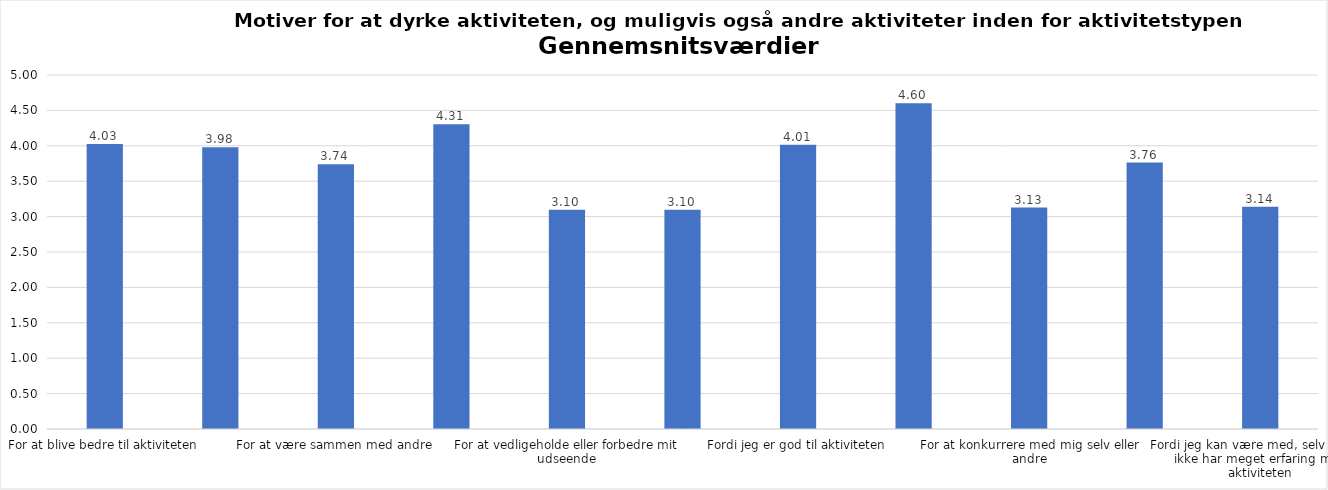
| Category | Gennemsnit |
|---|---|
| For at blive bedre til aktiviteten | 4.027 |
| For at vedligeholde eller forbedre min sundhed (fx helbred, fysisk form) | 3.978 |
| For at være sammen med andre | 3.739 |
| For at gøre noget godt for mig selv | 4.305 |
| For at vedligeholde eller forbedre mit udseende | 3.096 |
| Fordi andre i min omgangskreds opmuntrer mig til det | 3.096 |
| Fordi jeg er god til aktiviteten | 4.015 |
| Fordi jeg godt kan lide aktiviteten | 4.601 |
| For at konkurrere med mig selv eller andre | 3.128 |
| Fordi aktiviteten passer godt ind i min hverdag | 3.764 |
| Fordi jeg kan være med, selv om jeg ikke har meget erfaring med aktiviteten | 3.14 |